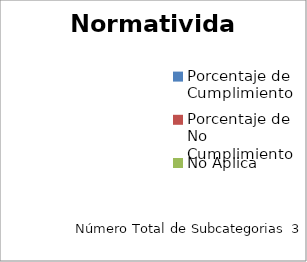
| Category | Normatividad |
|---|---|
| Porcentaje de Cumplimiento | 0 |
| Porcentaje de No Cumplimiento | 0 |
| No Aplica | 0 |